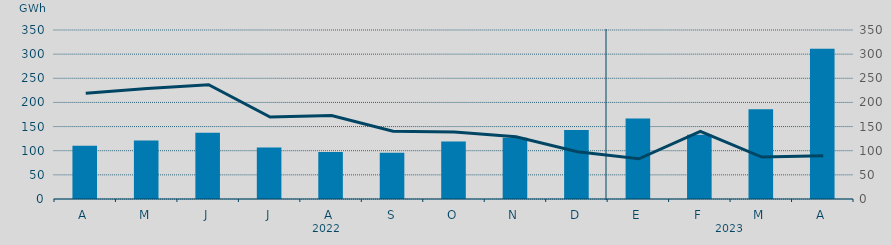
| Category | Energía a subir |
|---|---|
| A | 110.173 |
| M | 120.911 |
| J | 137.249 |
| J | 106.554 |
| A | 97.587 |
| S | 95.748 |
| O | 118.914 |
| N | 126.653 |
| D | 143.004 |
| E | 166.862 |
| F | 132.923 |
| M | 185.844 |
| A | 310.964 |